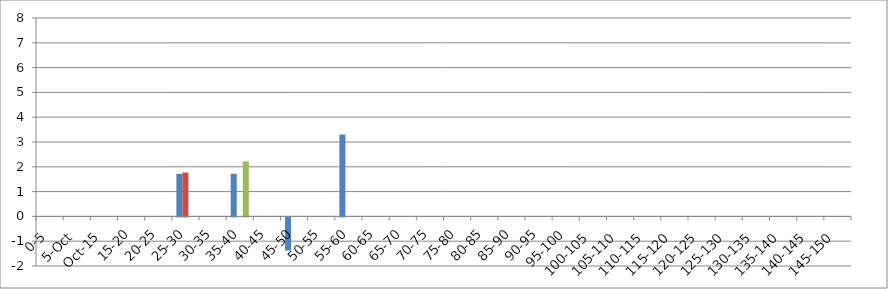
| Category | 12 UNION_ALL | 12 INTERSECTION_ALL | 12 UNION(INTERSECTION_119875_146067,INTERSECTION_119875_241240,INTERSECTION_146067_241240) |
|---|---|---|---|
| 0-5 | 0 | 0 | 0 |
| 5.Oct | 0 | 0 | 0 |
| Oct.15 | 0 | 0 | 0 |
| 15-20 | 0 | 0 | 0 |
| 20-25 | 0 | 0 | 0 |
| 25-30 | 1.709 | 1.766 | 0 |
| 30-35 | 0 | 0 | 0 |
| 35-40 | 1.718 | 0 | 2.218 |
| 40-45 | 0 | 0 | 0 |
| 45-50 | -1.335 | 0 | 0 |
| 50-55 | 0 | 0 | 0 |
| 55-60 | 3.301 | 0 | 0 |
| 60-65 | 0 | 0 | 0 |
| 65-70 | 0 | 0 | 0 |
| 70-75 | 0 | 0 | 0 |
| 75-80 | 0 | 0 | 0 |
| 80-85 | 0 | 0 | 0 |
| 85-90 | 0 | 0 | 0 |
| 90-95 | 0 | 0 | 0 |
| 95-100 | 0 | 0 | 0 |
| 100-105 | 0 | 0 | 0 |
| 105-110 | 0 | 0 | 0 |
| 110-115 | 0 | 0 | 0 |
| 115-120 | 0 | 0 | 0 |
| 120-125 | 0 | 0 | 0 |
| 125-130 | 0 | 0 | 0 |
| 130-135 | 0 | 0 | 0 |
| 135-140 | 0 | 0 | 0 |
| 140-145 | 0 | 0 | 0 |
| 145-150 | 0 | 0 | 0 |